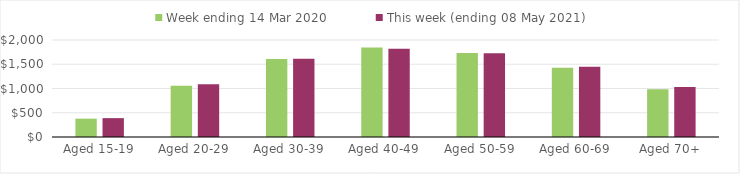
| Category | Week ending 14 Mar 2020 | This week (ending 08 May 2021) |
|---|---|---|
| Aged 15-19 | 378.06 | 389.2 |
| Aged 20-29 | 1055.37 | 1089.73 |
| Aged 30-39 | 1610.29 | 1615.83 |
| Aged 40-49 | 1846.74 | 1820.68 |
| Aged 50-59 | 1732.35 | 1724.69 |
| Aged 60-69 | 1428.88 | 1450.04 |
| Aged 70+ | 982.88 | 1028.54 |